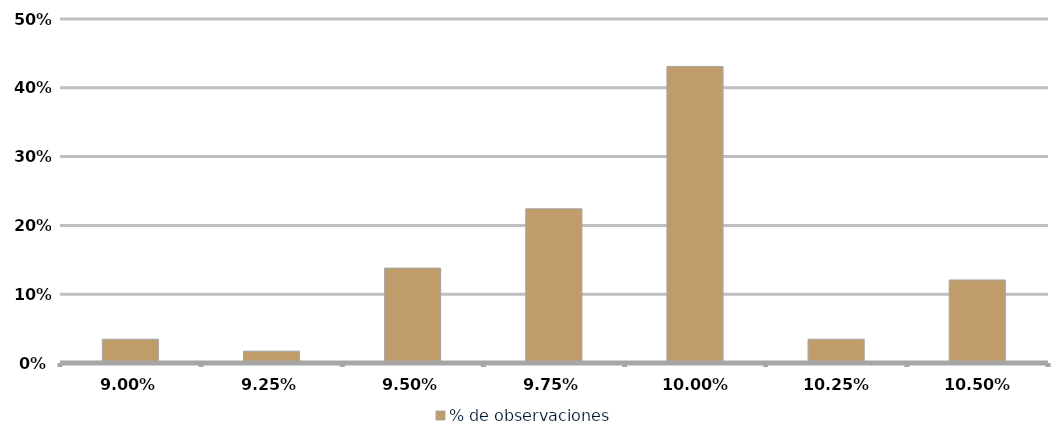
| Category | % de observaciones  |
|---|---|
| 0.09 | 0.034 |
| 0.0925 | 0.017 |
| 0.095 | 0.138 |
| 0.0975 | 0.224 |
| 0.1 | 0.431 |
| 0.10250000000000001 | 0.034 |
| 0.10500000000000001 | 0.121 |